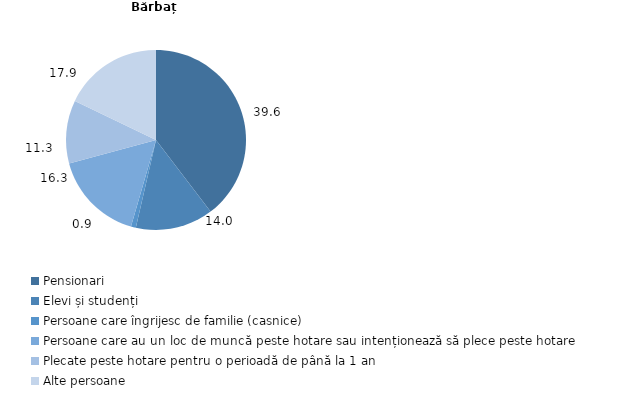
| Category | Bărbați |
|---|---|
| Pensionari | 39.64 |
| Elevi și studenți | 13.965 |
| Persoane care îngrijesc de familie (casnice) | 0.882 |
| Persoane care au un loc de muncă peste hotare sau intenționează să plece peste hotare | 16.321 |
| Plecate peste hotare pentru o perioadă de până la 1 an | 11.32 |
| Alte persoane | 17.871 |